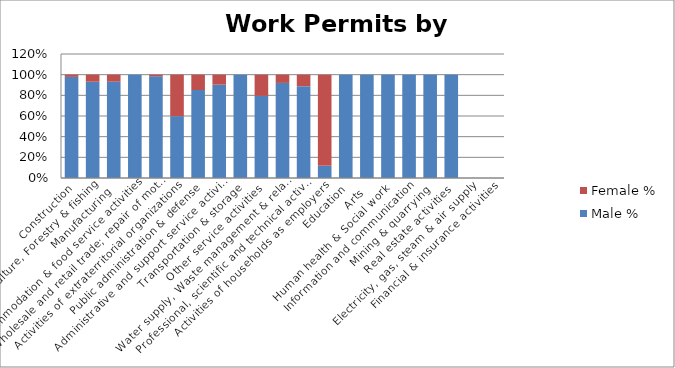
| Category | Male % | Female % |
|---|---|---|
| Construction | 0.978 | 0.022 |
| Agriculture, Forestry & fishing | 0.932 | 0.068 |
| Manufacturing | 0.933 | 0.067 |
| Accommodation & food service activities | 1 | 0 |
| Wholesale and retail trade; repair of motor vehicles  | 0.984 | 0.016 |
| Activities of extraterritorial organizations  | 0.598 | 0.402 |
| Public administration & defense | 0.851 | 0.149 |
| Administrative and support service activities | 0.903 | 0.097 |
|  Transportation & storage | 1 | 0 |
| Other service activities | 0.795 | 0.205 |
| Water supply, Waste management & related activities | 0.92 | 0.08 |
| Professional, scientific and technical activities | 0.889 | 0.111 |
| Activities of households as employers | 0.118 | 0.882 |
| Education | 1 | 0 |
| Arts | 1 | 0 |
| Human health & Social work | 1 | 0 |
|  Information and communication | 1 | 0 |
| Mining & quarrying | 1 | 0 |
| Real estate activities | 1 | 0 |
| Electricity, gas, steam & air supply | 0 | 0 |
| Financial & insurance activities | 0 | 0 |